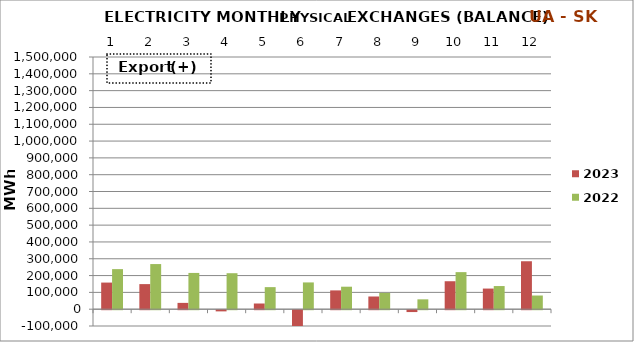
| Category | 2023 | 2022 |
|---|---|---|
| 0 | 158284.2 | 238326.25 |
| 1 | 149186.85 | 268399.825 |
| 2 | 37480.25 | 215617.925 |
| 3 | -7070.1 | 214019.225 |
| 4 | 33805.35 | 131185.95 |
| 5 | -157996.075 | 159177.25 |
| 6 | 111787.175 | 133737.8 |
| 7 | 75482.6 | 96990.575 |
| 8 | -11165.6 | 58556.625 |
| 9 | 166267.35 | 220427.7 |
| 10 | 122670.3 | 137593.25 |
| 11 | 285145.925 | 81299.725 |